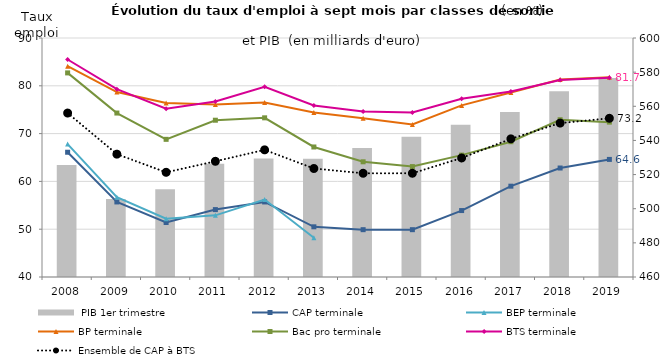
| Category |  PIB 1er trimestre |
|---|---|
| 2008.0 | 525.587 |
| 2009.0 | 505.716 |
| 2010.0 | 511.366 |
| 2011.0 | 526.286 |
| 2012.0 | 529.356 |
| 2013.0 | 529.29 |
| 2014.0 | 535.512 |
| 2015.0 | 542.195 |
| 2016.0 | 549.134 |
| 2017.0 | 556.591 |
| 2018.0 | 568.865 |
| 2019.0 | 576.535 |